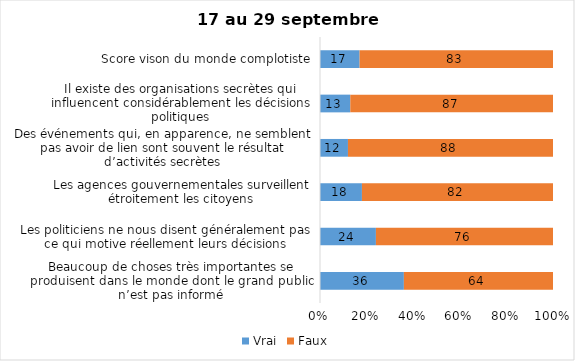
| Category | Vrai | Faux |
|---|---|---|
| Beaucoup de choses très importantes se produisent dans le monde dont le grand public n’est pas informé | 36 | 64 |
| Les politiciens ne nous disent généralement pas ce qui motive réellement leurs décisions | 24 | 76 |
| Les agences gouvernementales surveillent étroitement les citoyens | 18 | 82 |
| Des événements qui, en apparence, ne semblent pas avoir de lien sont souvent le résultat d’activités secrètes | 12 | 88 |
| Il existe des organisations secrètes qui influencent considérablement les décisions politiques | 13 | 87 |
| Score vison du monde complotiste | 17 | 83 |